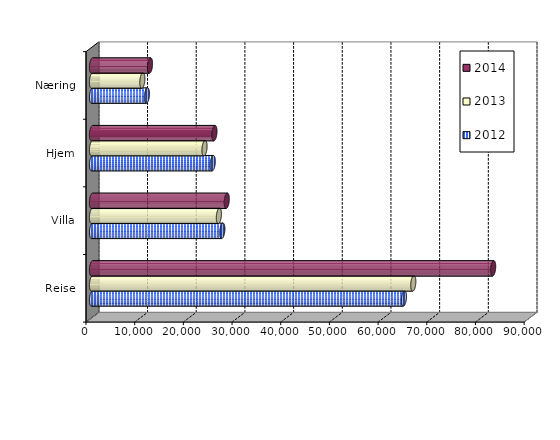
| Category | 2012 | 2013 | 2014 |
|---|---|---|---|
| Reise | 64072.417 | 65994.352 | 82399 |
| Villa | 26771.16 | 26063.869 | 27679 |
| Hjem | 24800.057 | 23110.983 | 25150 |
| Næring | 11277.262 | 10340.01 | 11918 |